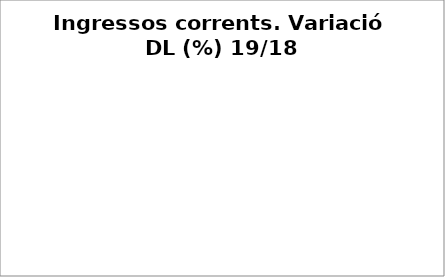
| Category | Series 0 |
|---|---|
| Impostos locals | 0.181 |
| Participació Tributs de l'Estat | 0.048 |
| Taxes i altres ingressos | 0.291 |
| Transferències corrents (exc. FCF) | 0.079 |
| Ingressos patrimonials | 0.222 |
| Ingressos corrents | 0.087 |